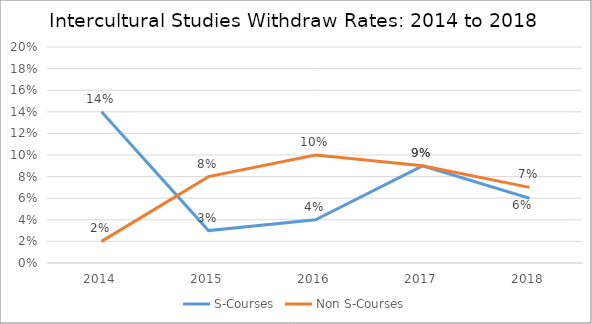
| Category | S-Courses | Non S-Courses |
|---|---|---|
| 2014.0 | 0.14 | 0.02 |
| 2015.0 | 0.03 | 0.08 |
| 2016.0 | 0.04 | 0.1 |
| 2017.0 | 0.09 | 0.09 |
| 2018.0 | 0.06 | 0.07 |